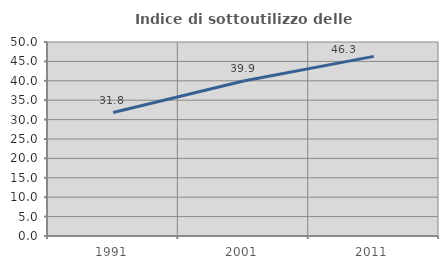
| Category | Indice di sottoutilizzo delle abitazioni  |
|---|---|
| 1991.0 | 31.817 |
| 2001.0 | 39.949 |
| 2011.0 | 46.292 |